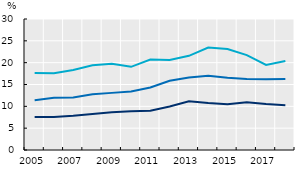
| Category | Low | Medium | High |
|---|---|---|---|
| 2005.0 | 17.646 | 11.408 | 7.551 |
| 2006.0 | 17.597 | 11.95 | 7.581 |
| 2007.0 | 18.34 | 12.05 | 7.843 |
| 2008.0 | 19.418 | 12.769 | 8.231 |
| 2009.0 | 19.767 | 13.082 | 8.665 |
| 2010.0 | 19.048 | 13.423 | 8.865 |
| 2011.0 | 20.721 | 14.321 | 9.002 |
| 2012.0 | 20.637 | 15.839 | 9.943 |
| 2013.0 | 21.567 | 16.607 | 11.148 |
| 2014.0 | 23.472 | 17.028 | 10.742 |
| 2015.0 | 23.123 | 16.521 | 10.458 |
| 2016.0 | 21.727 | 16.266 | 10.947 |
| 2017.0 | 19.481 | 16.212 | 10.543 |
| 2018.0 | 20.394 | 16.261 | 10.264 |